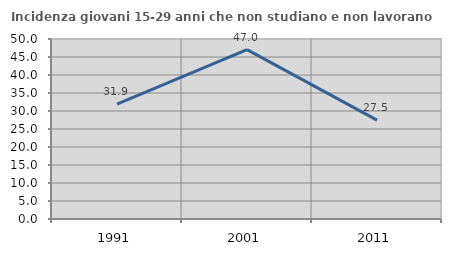
| Category | Incidenza giovani 15-29 anni che non studiano e non lavorano  |
|---|---|
| 1991.0 | 31.933 |
| 2001.0 | 47.042 |
| 2011.0 | 27.477 |